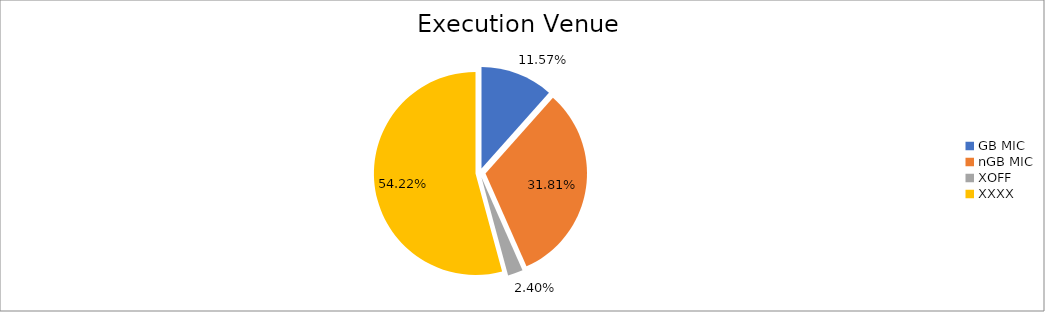
| Category | Series 0 |
|---|---|
| GB MIC | 1112909.923 |
| nGB MIC | 3059907.45 |
| XOFF | 230707.635 |
| XXXX | 5215730.833 |